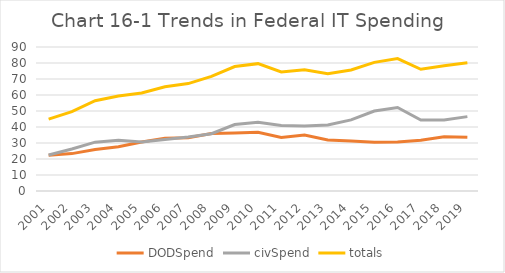
| Category | DODSpend | civSpend | totals |
|---|---|---|---|
| 2001.0 | 22.389 | 22.542 | 44.93 |
| 2002.0 | 23.37 | 26.277 | 49.647 |
| 2003.0 | 25.907 | 30.511 | 56.417 |
| 2004.0 | 27.674 | 31.653 | 59.327 |
| 2005.0 | 30.584 | 30.698 | 61.282 |
| 2006.0 | 33.035 | 32.159 | 65.194 |
| 2007.0 | 33.352 | 33.777 | 67.13 |
| 2008.0 | 35.871 | 35.797 | 71.668 |
| 2009.0 | 36.222 | 41.546 | 77.769 |
| 2010.0 | 36.652 | 42.941 | 79.594 |
| 2011.0 | 33.408 | 40.975 | 74.383 |
| 2012.0 | 35.032 | 40.69 | 75.722 |
| 2013.0 | 31.948 | 41.271 | 73.22 |
| 2014.0 | 31.202 | 44.445 | 75.647 |
| 2015.0 | 30.414 | 49.965 | 80.379 |
| 2016.0 | 30.578 | 52.212 | 82.79 |
| 2017.0 | 31.669 | 44.407 | 76.075 |
| 2018.0 | 33.956 | 44.367 | 78.323 |
| 2019.0 | 33.628 | 46.482 | 80.11 |